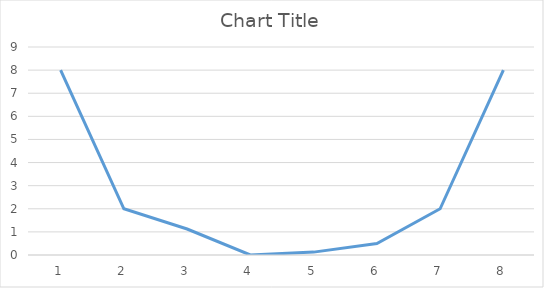
| Category | Series 0 |
|---|---|
| 0 | 8 |
| 1 | 2 |
| 2 | 1.125 |
| 3 | 0 |
| 4 | 0.125 |
| 5 | 0.5 |
| 6 | 2 |
| 7 | 8 |